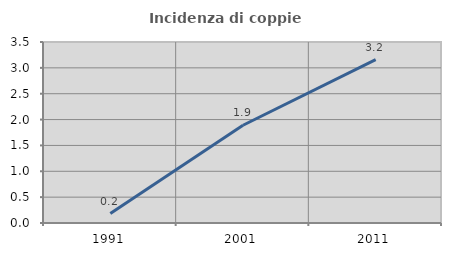
| Category | Incidenza di coppie miste |
|---|---|
| 1991.0 | 0.183 |
| 2001.0 | 1.89 |
| 2011.0 | 3.159 |